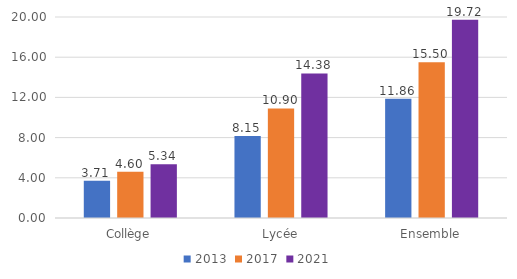
| Category | 2013 | 2017 | 2021 |
|---|---|---|---|
| Collège | 3.709 | 4.604 | 5.342 |
| Lycée | 8.151 | 10.897 | 14.381 |
| Ensemble | 11.86 | 15.501 | 19.723 |